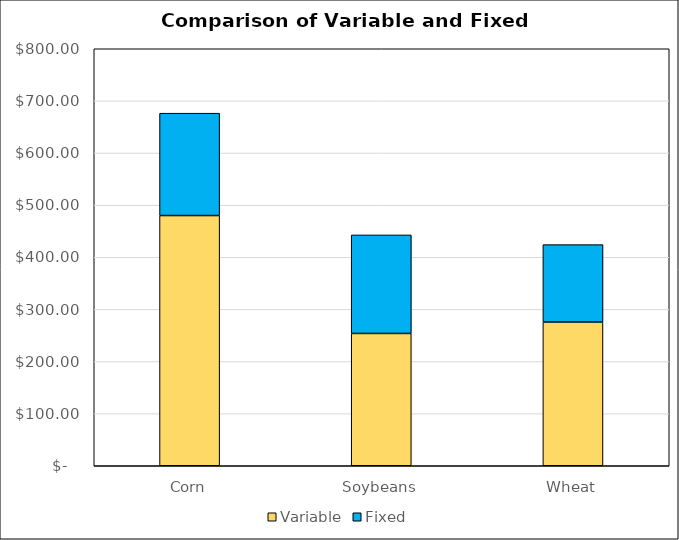
| Category | Variable | Fixed |
|---|---|---|
| Corn | 480.011 | 196.39 |
| Soybeans | 253.814 | 189.05 |
| Wheat | 275.722 | 148.52 |